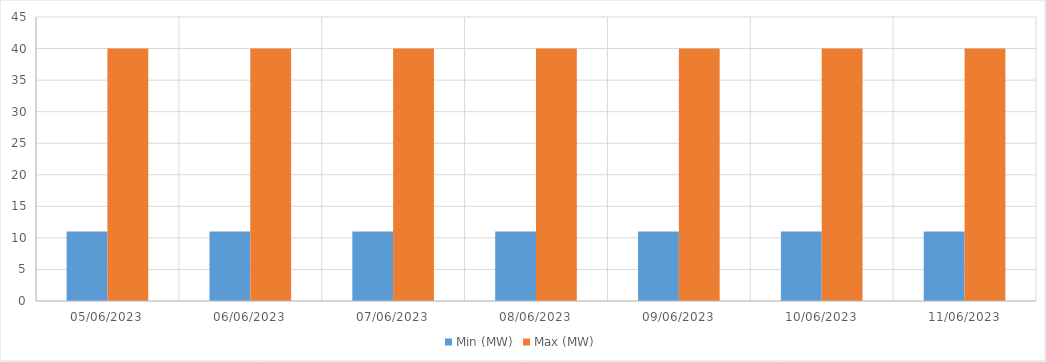
| Category | Min (MW) | Max (MW) |
|---|---|---|
| 05/06/2023 | 11 | 40 |
| 06/06/2023 | 11 | 40 |
| 07/06/2023 | 11 | 40 |
| 08/06/2023 | 11 | 40 |
| 09/06/2023 | 11 | 40 |
| 10/06/2023 | 11 | 40 |
| 11/06/2023 | 11 | 40 |